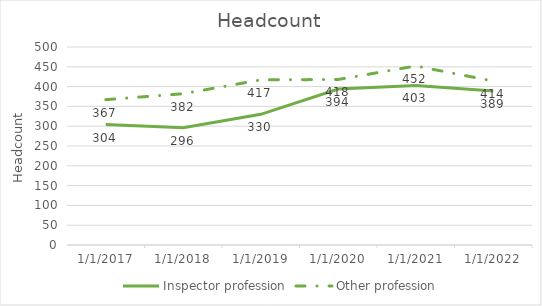
| Category | Inspector profession | Other profession |
|---|---|---|
| 3/31/17 | 304 | 367 |
| 3/31/18 | 296 | 382 |
| 3/31/19 | 330 | 417 |
| 3/31/20 | 394 | 418 |
| 3/31/21 | 403 | 452 |
| 3/31/22 | 389 | 414 |